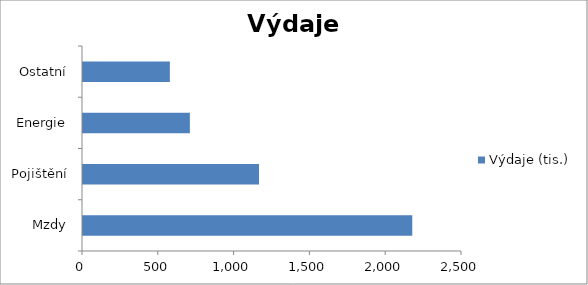
| Category | Výdaje (tis.) |
|---|---|
| Mzdy | 2172 |
| Pojištění | 1161 |
| Energie | 705 |
| Ostatní | 573 |